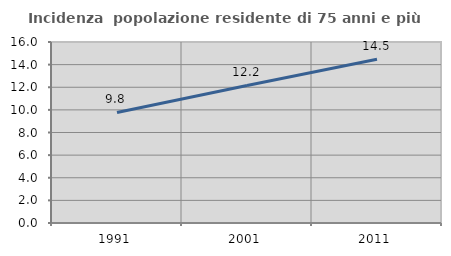
| Category | Incidenza  popolazione residente di 75 anni e più |
|---|---|
| 1991.0 | 9.775 |
| 2001.0 | 12.162 |
| 2011.0 | 14.478 |